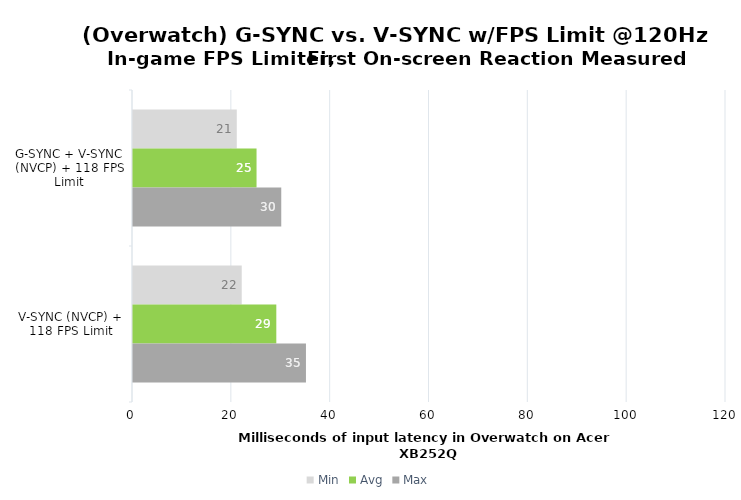
| Category | Min | Avg | Max |
|---|---|---|---|
| G-SYNC + V-SYNC (NVCP) + 118 FPS Limit | 21 | 25 | 30 |
| V-SYNC (NVCP) + 118 FPS Limit | 22 | 29 | 35 |